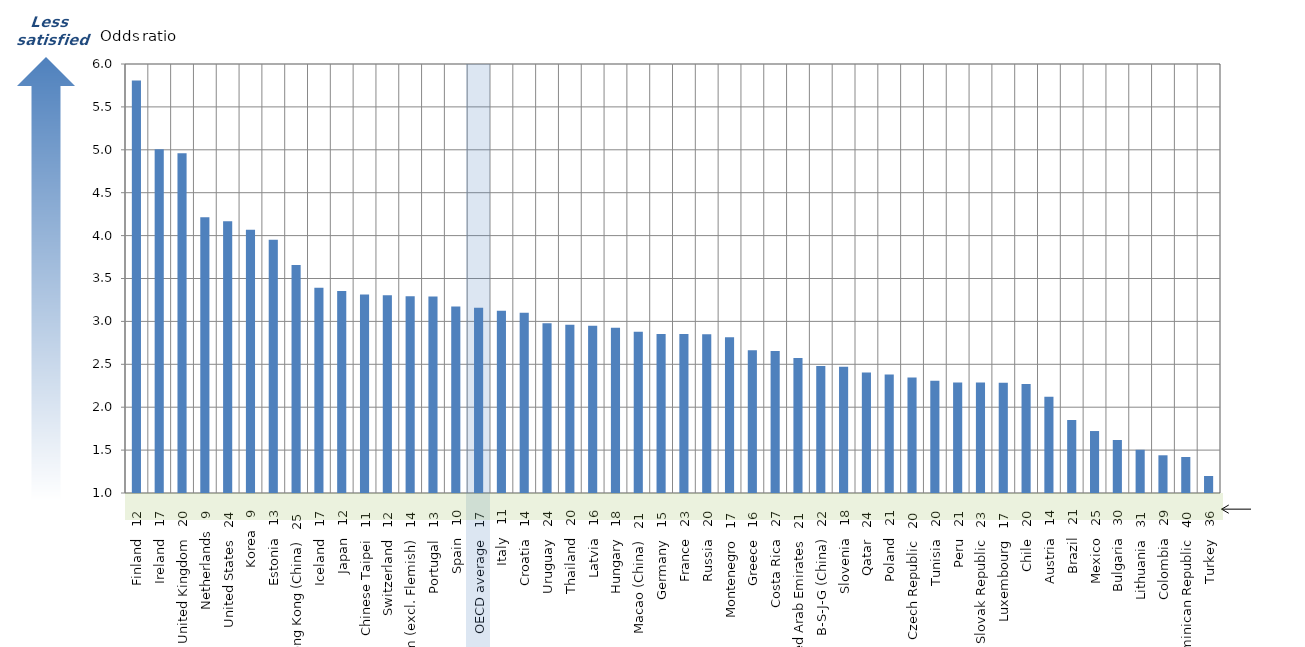
| Category | I feel like an outsider (or left out of things) at school |
|---|---|
| Finland   12 | 5.808 |
| Ireland   17 | 5.006 |
| United Kingdom   20 | 4.96 |
| Netherlands   9 | 4.213 |
| United States   24 | 4.167 |
| Korea   9 | 4.068 |
| Estonia   13 | 3.953 |
| Hong Kong (China)   25 | 3.657 |
| Iceland   17 | 3.392 |
| Japan   12 | 3.354 |
| Chinese Taipei   11 | 3.313 |
| Switzerland   12 | 3.305 |
| Belgium (excl. Flemish)   14 | 3.294 |
| Portugal   13 | 3.291 |
| Spain   10 | 3.173 |
| OECD average   17 | 3.158 |
| Italy   11 | 3.124 |
| Croatia   14 | 3.101 |
| Uruguay   24 | 2.978 |
| Thailand   20 | 2.96 |
| Latvia   16 | 2.949 |
| Hungary   18 | 2.927 |
| Macao (China)   21 | 2.88 |
| Germany   15 | 2.853 |
| France   23 | 2.852 |
| Russia   20 | 2.852 |
| Montenegro   17 | 2.814 |
| Greece   16 | 2.663 |
| Costa Rica   27 | 2.656 |
| United Arab Emirates   21 | 2.573 |
| B-S-J-G (China)   22 | 2.48 |
| Slovenia   18 | 2.471 |
| Qatar   24 | 2.406 |
| Poland   21 | 2.381 |
| Czech Republic   20 | 2.346 |
| Tunisia   20 | 2.308 |
| Peru   21 | 2.288 |
| Slovak Republic   23 | 2.288 |
| Luxembourg   17 | 2.284 |
| Chile   20 | 2.271 |
| Austria   14 | 2.121 |
| Brazil   21 | 1.851 |
| Mexico   25 | 1.722 |
| Bulgaria   30 | 1.618 |
| Lithuania   31 | 1.504 |
| Colombia   29 | 1.44 |
| Dominican Republic   40 | 1.42 |
| Turkey   36 | 1.198 |